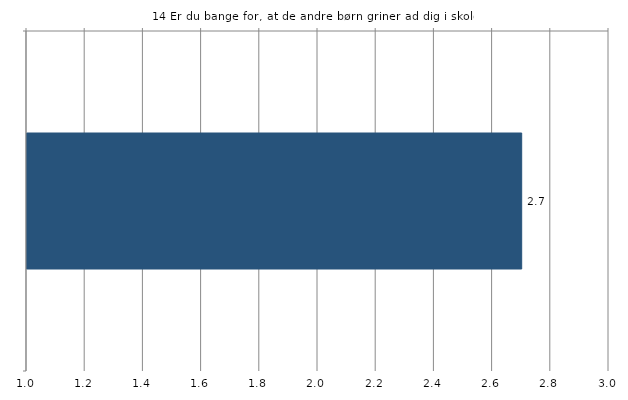
| Category | Gns. |
|---|---|
|   | 2.7 |